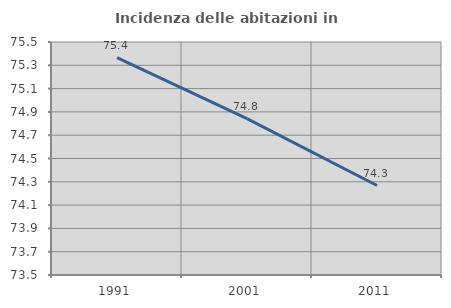
| Category | Incidenza delle abitazioni in proprietà  |
|---|---|
| 1991.0 | 75.365 |
| 2001.0 | 74.842 |
| 2011.0 | 74.268 |